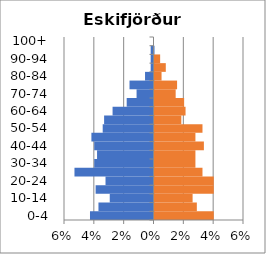
| Category | % Men | % Women |
|---|---|---|
| 0-4 | -0.043 | 0.04 |
| 5-9 | -0.037 | 0.028 |
| 10-14 | -0.029 | 0.026 |
| 15-19 | -0.039 | 0.04 |
| 20-24 | -0.032 | 0.04 |
| 25-29 | -0.053 | 0.032 |
| 30-34 | -0.04 | 0.027 |
| 35-39 | -0.038 | 0.027 |
| 40-44 | -0.04 | 0.033 |
| 45-49 | -0.042 | 0.027 |
| 50-54 | -0.034 | 0.032 |
| 55-59 | -0.033 | 0.018 |
| 60-64 | -0.027 | 0.021 |
| 65-69 | -0.018 | 0.02 |
| 70-74 | -0.011 | 0.014 |
| 75-79 | -0.016 | 0.015 |
| 80-84 | -0.006 | 0.005 |
| 85-89 | -0.002 | 0.008 |
| 90-94 | -0.002 | 0.004 |
| 95-99 | -0.002 | 0 |
| 100+ | 0 | 0 |